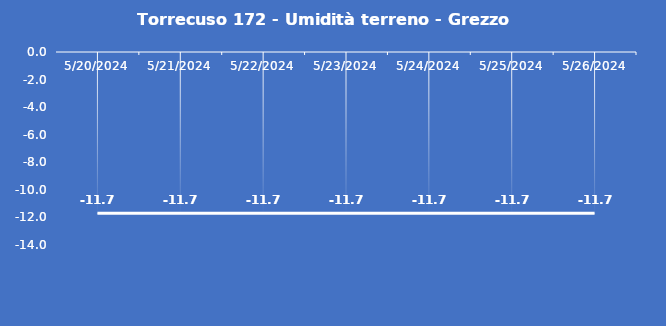
| Category | Torrecuso 172 - Umidità terreno - Grezzo (%VWC) |
|---|---|
| 5/20/24 | -11.7 |
| 5/21/24 | -11.7 |
| 5/22/24 | -11.7 |
| 5/23/24 | -11.7 |
| 5/24/24 | -11.7 |
| 5/25/24 | -11.7 |
| 5/26/24 | -11.7 |